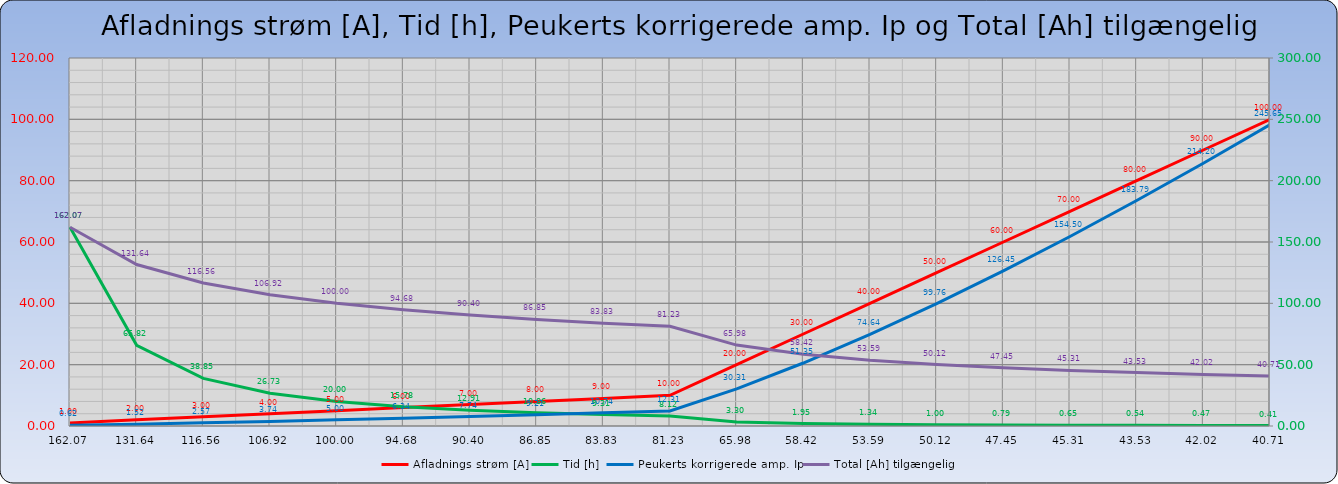
| Category | Afladnings strøm [A] |
|---|---|
| 162.06565966927624 | 1 |
| 131.63822043342375 | 2 |
| 116.56136506907157 | 3 |
| 106.9234599991188 | 4 |
| 100.0 | 5 |
| 94.67724809990739 | 6 |
| 90.39857599458092 | 7 |
| 86.84883661098434 | 8 |
| 83.83362554714647 | 9 |
| 81.22523963562355 | 10 |
| 65.9753955386447 | 20 |
| 58.419068106786554 | 30 |
| 53.58867312681467 | 40 |
| 50.11872336272722 | 50 |
| 47.4510280626355 | 60 |
| 45.30661222656873 | 70 |
| 43.527528164806206 | 80 |
| 42.01634287291894 | 90 |
| 40.709053153690434 | 100 |